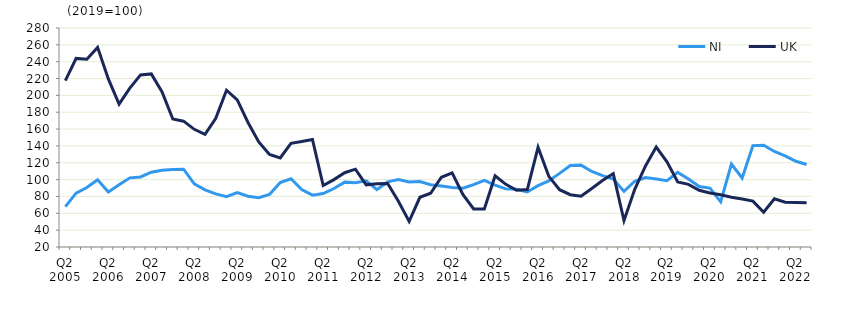
| Category | NI | UK  |
|---|---|---|
| Q2 2005 | 68 | 217.6 |
|  | 83.9 | 243.9 |
| Q4 2005 | 90.7 | 243 |
|  | 99.9 | 257 |
| Q2 2006 | 85.3 | 219.5 |
|  | 93.8 | 189.6 |
| Q4 2006 | 102.1 | 208.6 |
|  | 103.2 | 224.3 |
| Q2 2007 | 108.8 | 225.5 |
|  | 111.1 | 204 |
| Q4 2007 | 112 | 172 |
|  | 112.4 | 169.4 |
| Q2 2008 | 94.9 | 159.7 |
|  | 87.9 | 153.8 |
| Q4 2008 | 83 | 172.7 |
|  | 79.8 | 206.1 |
| Q2 2009 | 84.5 | 194.7 |
|  | 80.3 | 167.8 |
| Q4 2009 | 78.6 | 144.8 |
|  | 82.4 | 129.8 |
| Q2 2010 | 96.6 | 125.8 |
|  | 101 | 143 |
| Q4 2010 | 88.3 | 145.3 |
|  | 81.5 | 147.7 |
| Q2 2011 | 83.5 | 92.9 |
|  | 89.4 | 100 |
| Q4 2011 | 97 | 108.2 |
|  | 96.4 | 112.4 |
| Q2 2012 | 98.5 | 93.8 |
|  | 88 | 95 |
| Q4 2012 | 97.4 | 95.4 |
|  | 100 | 74.3 |
| Q2 2013 | 97.1 | 50.4 |
|  | 97.8 | 79 |
| Q4 2013 | 94 | 83.8 |
|  | 92.4 | 102.8 |
| Q2 2014 | 90.7 | 108 |
|  | 89.9 | 82.5 |
| Q4 2014 | 94 | 65.2 |
|  | 99.1 | 65.1 |
| Q2 2015 | 93.4 | 104.6 |
|  | 89 | 94.4 |
| Q4 2015 | 88.5 | 87.3 |
|  | 85.3 | 88.2 |
| Q2 2016 | 92.8 | 138.4 |
|  | 98.4 | 103.9 |
| Q4 2016 | 107.4 | 88 |
|  | 116.8 | 82.1 |
| Q2 2017 | 117.2 | 80.3 |
|  | 109.7 | 89.5 |
| Q4 2017 | 104.8 | 99 |
|  | 100.7 | 107.2 |
| Q2 2018 | 86 | 51.5 |
|  | 98.1 | 88.5 |
| Q4 2018 | 102.5 | 116.2 |
|  | 100.7 | 138.6 |
| Q2 2019 | 98.7 | 121.2 |
|  | 108.6 | 97.2 |
| Q4 2019 | 100.8 | 94.4 |
|  | 91.8 | 87.3 |
| Q2 2020 | 89.9 | 84.1 |
|  | 73.6 | 82 |
| Q4 2020 | 118.4 | 79.1 |
|  | 101.9 | 77 |
| Q2 2021 | 140.4 | 74.5 |
|  | 140.9 | 61.2 |
| Q4 2021 | 133.4 | 77.2 |
|  | 128.1 | 73.1 |
| Q2 2022 | 121.8 | 72.7 |